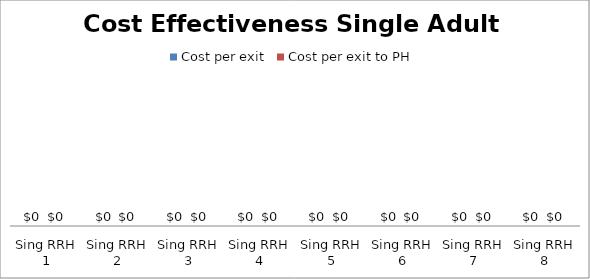
| Category | Cost per exit | Cost per exit to PH |
|---|---|---|
| Sing RRH 1 | 0 | 0 |
| Sing RRH 2 | 0 | 0 |
| Sing RRH 3 | 0 | 0 |
| Sing RRH 4 | 0 | 0 |
| Sing RRH 5 | 0 | 0 |
| Sing RRH 6 | 0 | 0 |
| Sing RRH 7 | 0 | 0 |
| Sing RRH 8 | 0 | 0 |